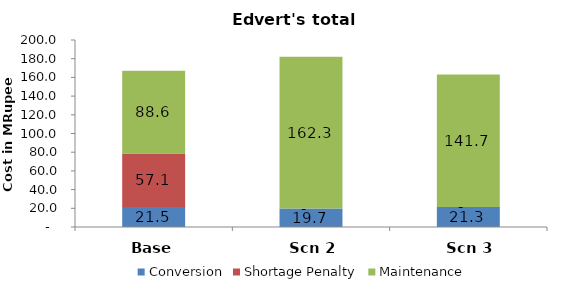
| Category | Conversion | Shortage Penalty | Maintenance |
|---|---|---|---|
| Base | 21.5 | 57.12 | 88.575 |
| Scn 2 | 19.7 | 0 | 162.33 |
| Scn 3 | 21.3 | 0 | 141.675 |